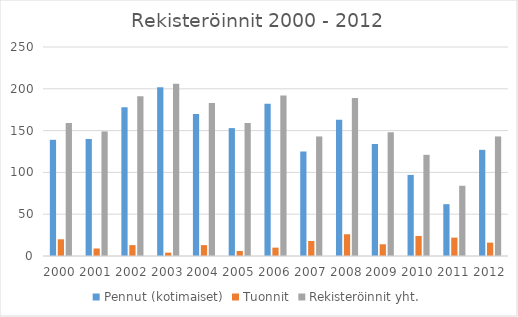
| Category | Pennut (kotimaiset) | Tuonnit | Rekisteröinnit yht. |
|---|---|---|---|
| 2000.0 | 139 | 20 | 159 |
| 2001.0 | 140 | 9 | 149 |
| 2002.0 | 178 | 13 | 191 |
| 2003.0 | 202 | 4 | 206 |
| 2004.0 | 170 | 13 | 183 |
| 2005.0 | 153 | 6 | 159 |
| 2006.0 | 182 | 10 | 192 |
| 2007.0 | 125 | 18 | 143 |
| 2008.0 | 163 | 26 | 189 |
| 2009.0 | 134 | 14 | 148 |
| 2010.0 | 97 | 24 | 121 |
| 2011.0 | 62 | 22 | 84 |
| 2012.0 | 127 | 16 | 143 |